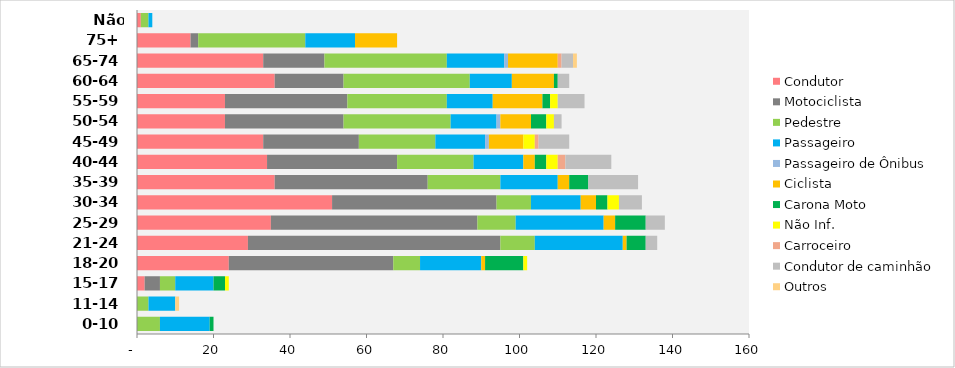
| Category | Condutor | Motociclista | Pedestre | Passageiro | Passageiro de Ônibus | Ciclista | Carona Moto | Não Inf. | Carroceiro | Condutor de caminhão | Outros |
|---|---|---|---|---|---|---|---|---|---|---|---|
| 0-10 | 0 | 0 | 6 | 13 | 0 | 0 | 1 | 0 | 0 | 0 | 0 |
| 11-14 | 0 | 0 | 3 | 7 | 0 | 0 | 0 | 0 | 0 | 0 | 1 |
| 15-17 | 2 | 4 | 4 | 10 | 0 | 0 | 3 | 1 | 0 | 0 | 0 |
| 18-20 | 24 | 43 | 7 | 16 | 0 | 1 | 10 | 1 | 0 | 0 | 0 |
| 21-24 | 29 | 66 | 9 | 23 | 0 | 1 | 5 | 0 | 0 | 3 | 0 |
| 25-29 | 35 | 54 | 10 | 23 | 0 | 3 | 8 | 0 | 0 | 5 | 0 |
| 30-34 | 51 | 43 | 9 | 13 | 0 | 4 | 3 | 3 | 0 | 6 | 0 |
| 35-39 | 36 | 40 | 19 | 15 | 0 | 3 | 5 | 0 | 0 | 13 | 0 |
| 40-44 | 34 | 34 | 20 | 13 | 0 | 3 | 3 | 3 | 2 | 12 | 0 |
| 45-49 | 33 | 25 | 20 | 13 | 1 | 9 | 0 | 3 | 1 | 8 | 0 |
| 50-54 | 23 | 31 | 28 | 12 | 1 | 8 | 4 | 2 | 0 | 2 | 0 |
| 55-59 | 23 | 32 | 26 | 12 | 0 | 13 | 2 | 2 | 0 | 7 | 0 |
| 60-64 | 36 | 18 | 33 | 11 | 0 | 11 | 1 | 0 | 0 | 3 | 0 |
| 65-74 | 33 | 16 | 32 | 15 | 1 | 13 | 0 | 0 | 1 | 3 | 1 |
| 75+ | 14 | 2 | 28 | 13 | 0 | 11 | 0 | 0 | 0 | 0 | 0 |
| Não informado | 1 | 0 | 2 | 1 | 0 | 0 | 0 | 0 | 0 | 0 | 0 |